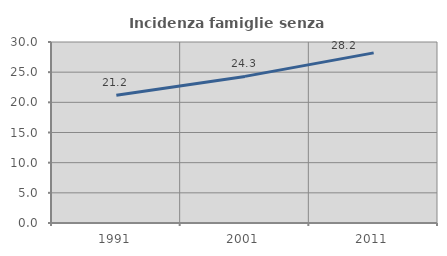
| Category | Incidenza famiglie senza nuclei |
|---|---|
| 1991.0 | 21.183 |
| 2001.0 | 24.3 |
| 2011.0 | 28.196 |